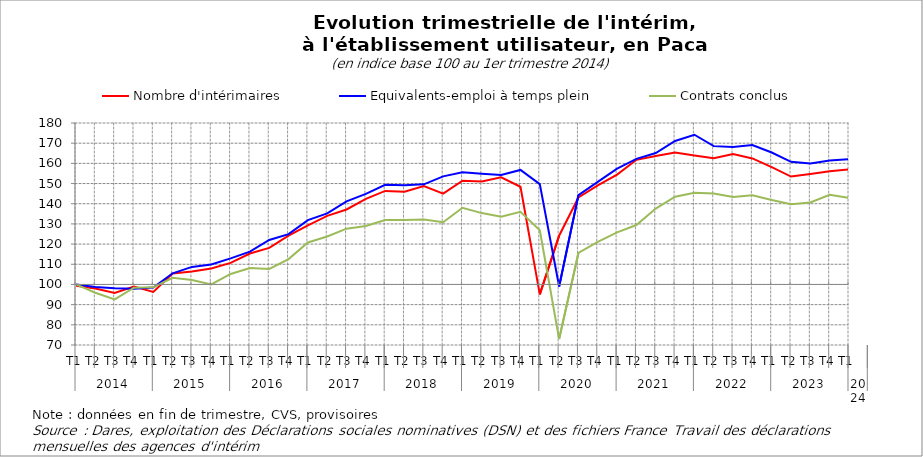
| Category | Nombre d'intérimaires | Equivalents-emploi à temps plein | Contrats conclus |
|---|---|---|---|
| 0 | 99.33 | 100 | 100 |
| 1 | 98.027 | 98.792 | 95.892 |
| 2 | 95.78 | 98.128 | 92.558 |
| 3 | 98.993 | 97.858 | 98.369 |
| 4 | 96.297 | 98.51 | 98.603 |
| 5 | 105.454 | 105.538 | 103.308 |
| 6 | 106.461 | 108.704 | 102.197 |
| 7 | 107.895 | 109.88 | 99.984 |
| 8 | 110.675 | 112.942 | 105.193 |
| 9 | 115.308 | 116.285 | 108.154 |
| 10 | 118.105 | 122.068 | 107.677 |
| 11 | 124.23 | 124.931 | 112.548 |
| 12 | 129.241 | 131.858 | 120.808 |
| 13 | 134.003 | 135.227 | 123.75 |
| 14 | 137.16 | 141.155 | 127.63 |
| 15 | 142.45 | 144.86 | 128.992 |
| 16 | 146.356 | 149.386 | 131.974 |
| 17 | 145.913 | 149.175 | 131.974 |
| 18 | 148.805 | 149.592 | 132.124 |
| 19 | 144.999 | 153.553 | 130.787 |
| 20 | 151.426 | 155.593 | 137.986 |
| 21 | 151.049 | 154.87 | 135.353 |
| 22 | 153.048 | 154.272 | 133.604 |
| 23 | 148.4 | 156.747 | 135.999 |
| 24 | 95.115 | 149.716 | 126.87 |
| 25 | 124.153 | 98.979 | 72.972 |
| 26 | 143.09 | 144.275 | 115.596 |
| 27 | 149.047 | 150.845 | 121.089 |
| 28 | 154.403 | 157.357 | 125.793 |
| 29 | 161.756 | 162.224 | 129.432 |
| 30 | 163.651 | 165.101 | 137.614 |
| 31 | 165.323 | 171.113 | 143.51 |
| 32 | 163.916 | 174.18 | 145.394 |
| 33 | 162.559 | 168.539 | 145.095 |
| 34 | 164.618 | 168.132 | 143.349 |
| 35 | 162.443 | 169.097 | 144.181 |
| 36 | 158.094 | 165.39 | 141.882 |
| 37 | 153.464 | 160.773 | 139.783 |
| 38 | 154.733 | 159.92 | 140.592 |
| 39 | 156.056 | 161.409 | 144.439 |
| 40 | 157.031 | 162.033 | 142.842 |